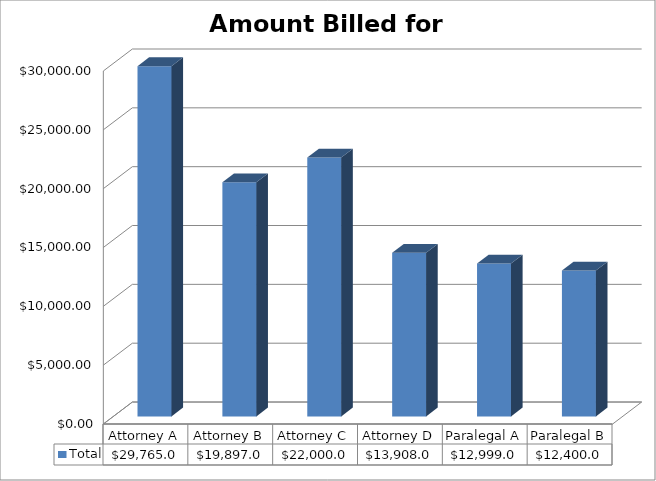
| Category | Total |
|---|---|
| Attorney A | 29765 |
| Attorney B | 19897 |
| Attorney C | 22000 |
| Attorney D | 13908 |
| Paralegal A | 12999 |
| Paralegal B | 12400 |